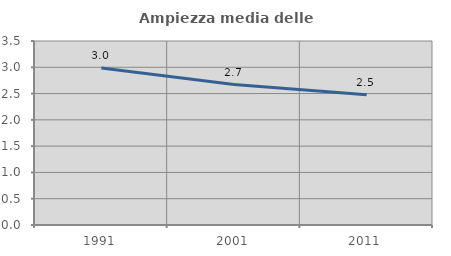
| Category | Ampiezza media delle famiglie |
|---|---|
| 1991.0 | 2.985 |
| 2001.0 | 2.672 |
| 2011.0 | 2.476 |